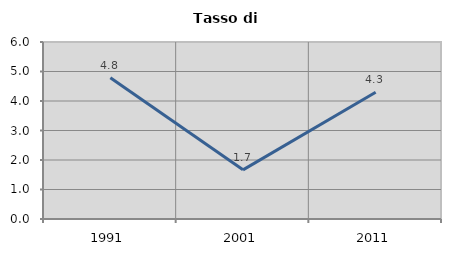
| Category | Tasso di disoccupazione   |
|---|---|
| 1991.0 | 4.79 |
| 2001.0 | 1.667 |
| 2011.0 | 4.297 |